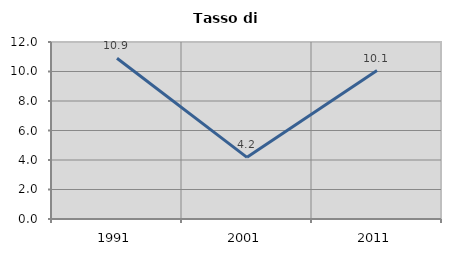
| Category | Tasso di disoccupazione   |
|---|---|
| 1991.0 | 10.902 |
| 2001.0 | 4.181 |
| 2011.0 | 10.065 |